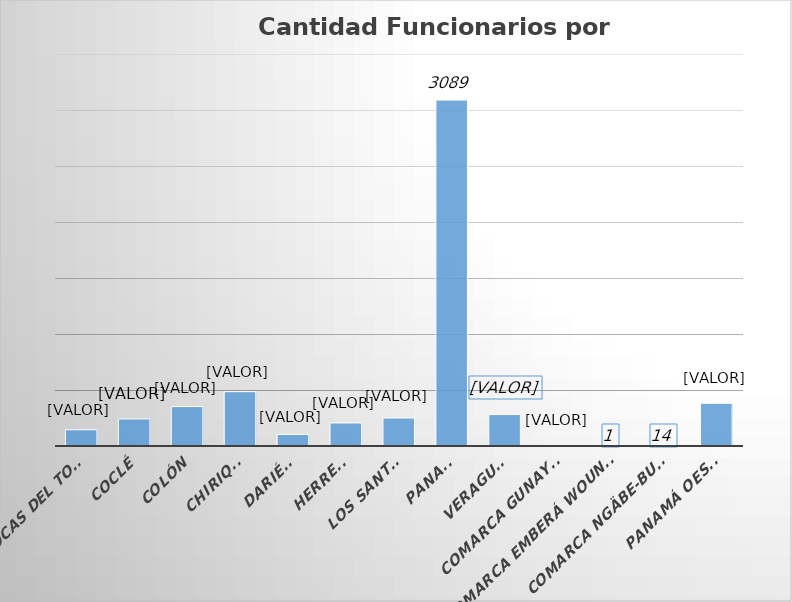
| Category | Cantidad  |
|---|---|
| BOCAS DEL TORO | 145 |
| COCLÉ | 242 |
| COLÓN | 352 |
| CHIRIQUÍ | 485 |
| DARIÉN | 103 |
| HERRERA | 206 |
| LOS SANTOS | 250 |
| PANAMÁ | 3089 |
| VERAGUAS | 281 |
| COMARCA GUNAYALA | 7 |
| COMARCA EMBERÁ WOUNAAN | 1 |
| COMARCA NGÄBE-BUGLÉ | 14 |
| PANAMÁ OESTE | 381 |